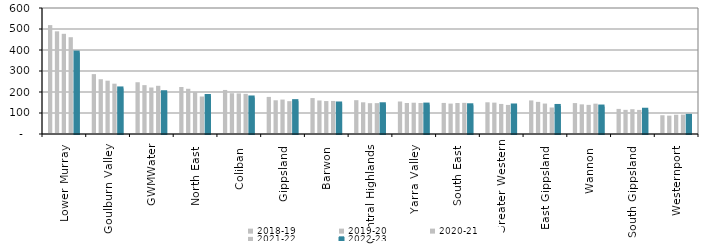
| Category | 2018-19 | 2019-20 | 2020-21 | 2021-22 | 2022-23 |
|---|---|---|---|---|---|
| Lower Murray  | 518.556 | 488.975 | 477.061 | 460.945 | 387.772 |
| Goulburn Valley  | 285.157 | 260.849 | 253.89 | 239.594 | 216.921 |
| GWMWater | 246.447 | 232.754 | 221.402 | 229.511 | 198.869 |
| North East  | 223.79 | 215.398 | 199.939 | 178.515 | 180.895 |
| Coliban  | 209.742 | 194.247 | 193.307 | 191.099 | 173.901 |
| Gippsland  | 176.608 | 160.564 | 163.972 | 156.377 | 156.453 |
| Barwon  | 171.116 | 159.665 | 156.84 | 157.421 | 145.31 |
| Central Highlands  | 161.029 | 150.933 | 146.681 | 147.009 | 141.53 |
| Yarra Valley  | 154.766 | 147.573 | 148.976 | 147.707 | 140.063 |
| South East  | 147.937 | 144.78 | 147.551 | 148.361 | 136.747 |
| Greater Western | 151.016 | 149.39 | 143.124 | 138.429 | 135.782 |
| East Gippsland  | 159.875 | 152.937 | 144.969 | 126.232 | 133.543 |
| Wannon  | 147.21 | 141.166 | 138.754 | 144.456 | 130.757 |
| South Gippsland  | 119.476 | 115.019 | 118.092 | 114.74 | 115.502 |
| Westernport  | 89.309 | 87.451 | 91.64 | 92.409 | 86.418 |